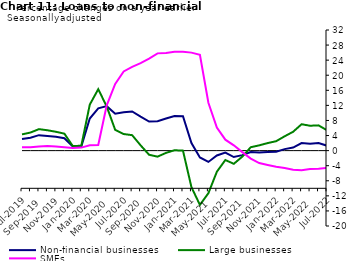
| Category | zero | Non-financial businesses | Large businesses | SMEs |
|---|---|---|---|---|
| Jul-2019 | 0 | 3.1 | 4.3 | 0.9 |
| Aug-2019 | 0 | 3.4 | 4.8 | 0.9 |
| Sep-2019 | 0 | 4.1 | 5.7 | 1.1 |
| Oct-2019 | 0 | 3.9 | 5.4 | 1.2 |
| Nov-2019 | 0 | 3.7 | 5 | 1.1 |
| Dec-2019 | 0 | 3.3 | 4.5 | 0.9 |
| Jan-2020 | 0 | 1.1 | 1.2 | 0.7 |
| Feb-2020 | 0 | 1.1 | 1.3 | 0.8 |
| Mar-2020 | 0 | 8.5 | 12.2 | 1.4 |
| Apr-2020 | 0 | 11.2 | 16.3 | 1.5 |
| May-2020 | 0 | 11.8 | 11.7 | 12 |
| Jun-2020 | 0 | 9.8 | 5.5 | 17.7 |
| Jul-2020 | 0 | 10.2 | 4.4 | 21 |
| Aug-2020 | 0 | 10.4 | 4.1 | 22.2 |
| Sep-2020 | 0 | 9 | 1.4 | 23.2 |
| Oct-2020 | 0 | 7.7 | -1.1 | 24.4 |
| Nov-2020 | 0 | 7.8 | -1.6 | 25.8 |
| Dec-2020 | 0 | 8.5 | -0.6 | 25.9 |
| Jan-2021 | 0 | 9.2 | 0.1 | 26.2 |
| Feb-2021 | 0 | 9.1 | 0 | 26.2 |
| Mar-2021 | 0 | 2 | -9.7 | 26 |
| Apr-2021 | 0 | -1.8 | -14.4 | 25.4 |
| May-2021 | 0 | -3 | -11.3 | 12.7 |
| Jun-2021 | 0 | -1.3 | -5.6 | 6.1 |
| Jul-2021 | 0 | -0.5 | -2.5 | 2.9 |
| Aug-2021 | 0 | -1.7 | -3.5 | 1.4 |
| Sep-2021 | 0 | -1.2 | -1.6 | -0.4 |
| Oct-2021 | 0 | -0.4 | 0.9 | -2.1 |
| Nov-2021 | 0 | -0.5 | 1.4 | -3.3 |
| Dec-2021 | 0 | -0.4 | 2 | -3.8 |
| Jan-2022 | 0 | -0.3 | 2.5 | -4.3 |
| Feb-2022 | 0 | 0.4 | 3.8 | -4.6 |
| Mar-2022 | 0 | 0.8 | 5 | -5.1 |
| Apr-2022 | 0 | 2 | 7 | -5.2 |
| May-2022 | 0 | 1.8 | 6.6 | -4.9 |
| Jun-2022 | 0 | 2 | 6.7 | -4.8 |
| Jul-2022 | 0 | 1.3 | 5.4 | -4.6 |